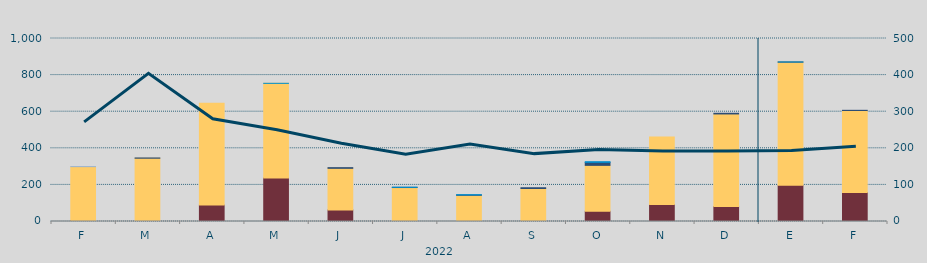
| Category | Carbón | Ciclo Combinado | Cogeneración | Consumo Bombeo | Eólica | Hidráulica | Otras Renovables | Solar fotovoltaica | Solar térmica | Turbinación bombeo | Nuclear |
|---|---|---|---|---|---|---|---|---|---|---|---|
| F | 5118.6 | 294678.7 | 0 | 0 | 0 | 0 | 0 | 0 | 0 | 84.5 | 0 |
| M | 280 | 345584.7 | 0 | 1304.2 | 0 | 0 | 0 | 0 | 0 | 0 | 0 |
| A | 89745.4 | 556069.1 | 0 | 0 | 0 | 0 | 0 | 0 | 0 | 0 | 0 |
| M | 238246.1 | 516625.8 | 0 | 0 | 0 | 170 | 0 | 0 | 0 | 0 | 0 |
| J | 63431.6 | 227120.9 | 0 | 3696.9 | 0 | 0 | 0 | 0 | 0 | 0 | 0 |
| J | 347.9 | 185242.2 | 0 | 1000 | 0 | 958 | 0 | 0 | 0 | 0 | 0 |
| A | 0 | 142890.1 | 241.5 | 1836 | 0 | 1759 | 0 | 0 | 0 | 0 | 0 |
| S | 2508 | 177724.1 | 0 | 4233 | 0 | 0 | 52.5 | 0 | 0 | 0 | 0 |
| O | 55771 | 250950.8 | 0 | 16354.2 | 0 | 3609 | 27 | 0 | 0 | 0 | 0 |
| N | 92910 | 369242.3 | 0 | 0 | 0 | 0 | 0 | 0 | 0 | 0 | 0 |
| D | 82210 | 505508.6 | 0 | 3568.7 | 0 | 0 | 0 | 0 | 0 | 0 | 0 |
| E | 198667 | 672278.9 | 0 | 600 | 0 | 167.2 | 0 | 0 | 0 | 0 | 0 |
| F | 158446.8 | 448230.6 | 0 | 876 | 0 | 0 | 0 | 0 | 0 | 0 | 0 |